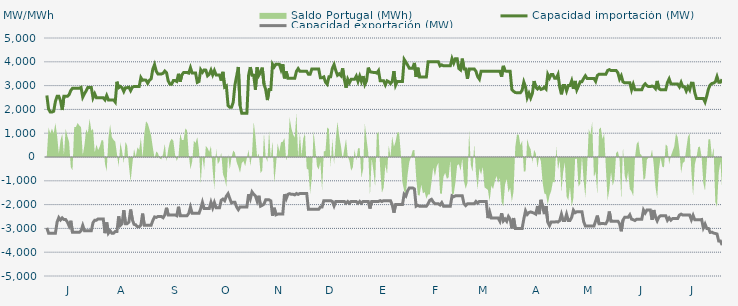
| Category | Capacidad importación (MW) | Capacidad exportación (MW) |
|---|---|---|
| 0 | 2585.417 | -2975 |
| 1900-01-01 | 2012.5 | -3200 |
| 1900-01-02 | 1887.5 | -3200 |
| 1900-01-03 | 1887.5 | -3200 |
| 1900-01-04 | 1920.833 | -3200 |
| 1900-01-05 | 2333.333 | -3200 |
| 1900-01-06 | 2550 | -2733.333 |
| 1900-01-07 | 2550 | -2545.833 |
| 1900-01-08 | 2362.5 | -2645.833 |
| 1900-01-09 | 1975 | -2558.333 |
| 1900-01-10 | 2550 | -2629.167 |
| 1900-01-11 | 2550 | -2629.167 |
| 1900-01-12 | 2550 | -2729.167 |
| 1900-01-13 | 2616.667 | -2895.833 |
| 1900-01-14 | 2793.75 | -2679.167 |
| 1900-01-15 | 2887.5 | -3166.667 |
| 1900-01-16 | 2887.5 | -3166.667 |
| 1900-01-17 | 2887.5 | -3166.667 |
| 1900-01-18 | 2887.5 | -3166.667 |
| 1900-01-19 | 2887.5 | -3166.667 |
| 1900-01-20 | 2925 | -3100 |
| 1900-01-21 | 2512.5 | -2875 |
| 1900-01-22 | 2658.333 | -3100 |
| 1900-01-23 | 2779.167 | -3100 |
| 1900-01-24 | 2925 | -3100 |
| 1900-01-25 | 2925 | -3100 |
| 1900-01-26 | 2925 | -3100 |
| 1900-01-27 | 2487.5 | -2758.333 |
| 1900-01-28 | 2656.25 | -2658.333 |
| 1900-01-29 | 2487.5 | -2654.167 |
| 1900-01-30 | 2487.5 | -2600 |
| 1900-01-31 | 2487.5 | -2600 |
| 1900-02-01 | 2487.5 | -2600 |
| 1900-02-02 | 2487.5 | -2600 |
| 1900-02-03 | 2400 | -3200 |
| 1900-02-04 | 2583.333 | -2750 |
| 1900-02-05 | 2400 | -3200 |
| 1900-02-06 | 2400 | -3100 |
| 1900-02-07 | 2400 | -3200 |
| 1900-02-08 | 2400 | -3200 |
| 1900-02-09 | 2308.333 | -3133.333 |
| 1900-02-10 | 3162.5 | -3133.333 |
| 1900-02-11 | 2910.417 | -2495.833 |
| 1900-02-12 | 2962.5 | -2875 |
| 1900-02-13 | 2912.5 | -2800 |
| 1900-02-14 | 2752.083 | -2237.5 |
| 1900-02-15 | 2912.5 | -2800 |
| 1900-02-16 | 2912.5 | -2800 |
| 1900-02-17 | 2933.333 | -2733.333 |
| 1900-02-18 | 2787.5 | -2208.333 |
| 1900-02-19 | 2929.167 | -2633.333 |
| 1900-02-20 | 2962.5 | -2829.167 |
| 1900-02-21 | 2962.5 | -2850 |
| 1900-02-22 | 2962.5 | -2933.333 |
| 1900-02-23 | 2962.5 | -2933.333 |
| 1900-02-24 | 3337.5 | -2866.667 |
| 1900-02-25 | 3222.917 | -2379.167 |
| 1900-02-26 | 3237.5 | -2866.667 |
| 1900-02-27 | 3225 | -2866.667 |
| 1900-02-28 | 3095.833 | -2866.667 |
| 1900-02-28 | 3225 | -2866.667 |
| 1900-03-01 | 3281.25 | -2866.667 |
| 1900-03-02 | 3700 | -2666.667 |
| 1900-03-03 | 3883.333 | -2516.667 |
| 1900-03-04 | 3600 | -2537.5 |
| 1900-03-05 | 3487.5 | -2500 |
| 1900-03-06 | 3487.5 | -2500 |
| 1900-03-07 | 3487.5 | -2500 |
| 1900-03-08 | 3518.75 | -2550 |
| 1900-03-09 | 3612.5 | -2433.333 |
| 1900-03-10 | 3543.75 | -2133.333 |
| 1900-03-11 | 3193.75 | -2433.333 |
| 1900-03-12 | 3060.417 | -2433.333 |
| 1900-03-13 | 3059.167 | -2433.333 |
| 1900-03-14 | 3212.5 | -2433.333 |
| 1900-03-15 | 3212.5 | -2433.333 |
| 1900-03-16 | 3175 | -2466.667 |
| 1900-03-17 | 3495.833 | -2091.667 |
| 1900-03-18 | 3166.667 | -2466.667 |
| 1900-03-19 | 3454.167 | -2466.667 |
| 1900-03-20 | 3550 | -2466.667 |
| 1900-03-21 | 3550 | -2466.667 |
| 1900-03-22 | 3550 | -2466.667 |
| 1900-03-23 | 3525 | -2366.667 |
| 1900-03-24 | 3754.167 | -2104.167 |
| 1900-03-25 | 3525 | -2366.667 |
| 1900-03-26 | 3525 | -2366.667 |
| 1900-03-27 | 3525 | -2366.667 |
| 1900-03-28 | 3135 | -2366.667 |
| 1900-03-29 | 3175 | -2366.667 |
| 1900-03-30 | 3666.667 | -2166.667 |
| 1900-03-31 | 3558.333 | -1904.167 |
| 1900-04-01 | 3658.333 | -2166.667 |
| 1900-04-02 | 3650 | -2166.667 |
| 1900-04-03 | 3412.5 | -2166.667 |
| 1900-04-04 | 3475 | -2166.667 |
| 1900-04-05 | 3650 | -1904.167 |
| 1900-04-06 | 3450 | -2133.333 |
| 1900-04-07 | 3633.333 | -1912.5 |
| 1900-04-08 | 3450 | -2133.333 |
| 1900-04-09 | 3450 | -2133.333 |
| 1900-04-10 | 3450 | -2133.333 |
| 1900-04-11 | 3210.417 | -1816.667 |
| 1900-04-12 | 3577.083 | -1766.667 |
| 1900-04-13 | 2937.5 | -1833.333 |
| 1900-04-14 | 2985.417 | -1645.833 |
| 1900-04-15 | 2162.5 | -1541.667 |
| 1900-04-16 | 2087.5 | -1745.833 |
| 1900-04-17 | 2087.5 | -1929.167 |
| 1900-04-18 | 2295.833 | -1900 |
| 1900-04-19 | 3025 | -1900 |
| 1900-04-20 | 3395.833 | -2100 |
| 1900-04-21 | 3781.25 | -2212.5 |
| 1900-04-22 | 2170.833 | -2100 |
| 1900-04-23 | 1837.5 | -2100 |
| 1900-04-24 | 1837.5 | -2100 |
| 1900-04-25 | 1837.5 | -2100 |
| 1900-04-26 | 1837.5 | -2100 |
| 1900-04-27 | 3433.333 | -1566.667 |
| 1900-04-28 | 3776 | -1760 |
| 1900-04-29 | 3433.333 | -1466.667 |
| 1900-04-30 | 3433.333 | -1566.667 |
| 1900-05-01 | 2829.167 | -1633.333 |
| 1900-05-02 | 3766.667 | -1854.167 |
| 1900-05-03 | 3433.333 | -1629.167 |
| 1900-05-04 | 3562.5 | -2066.667 |
| 1900-05-05 | 3754.167 | -2029.167 |
| 1900-05-06 | 3064.583 | -1979.167 |
| 1900-05-07 | 2833.333 | -1800 |
| 1900-05-08 | 2391.667 | -1800 |
| 1900-05-09 | 2833.333 | -1800 |
| 1900-05-10 | 2833.333 | -1841.667 |
| 1900-05-11 | 3900 | -2466.667 |
| 1900-05-12 | 3787.5 | -2133.333 |
| 1900-05-13 | 3900 | -2429.167 |
| 1900-05-14 | 3900 | -2400 |
| 1900-05-15 | 3900 | -2400 |
| 1900-05-16 | 3668.75 | -2400 |
| 1900-05-17 | 3900 | -2400 |
| 1900-05-18 | 3304.167 | -1566.667 |
| 1900-05-19 | 3595.833 | -1754.167 |
| 1900-05-20 | 3304.167 | -1566.667 |
| 1900-05-21 | 3304.167 | -1541.667 |
| 1900-05-22 | 3304.167 | -1566.667 |
| 1900-05-23 | 3304.167 | -1566.667 |
| 1900-05-24 | 3304.167 | -1591.667 |
| 1900-05-25 | 3600 | -1533.333 |
| 1900-05-26 | 3712.5 | -1570.833 |
| 1900-05-27 | 3600 | -1533.333 |
| 1900-05-28 | 3600 | -1533.333 |
| 1900-05-29 | 3600 | -1533.333 |
| 1900-05-30 | 3600 | -1533.333 |
| 1900-05-31 | 3600 | -1533.333 |
| 1900-06-01 | 3475 | -2200 |
| 1900-06-02 | 3475 | -2200 |
| 1900-06-03 | 3700 | -2200 |
| 1900-06-04 | 3700 | -2200 |
| 1900-06-05 | 3700 | -2200 |
| 1900-06-06 | 3700 | -2200 |
| 1900-06-07 | 3700 | -2200 |
| 1900-06-08 | 3329.167 | -2095.833 |
| 1900-06-09 | 3329.167 | -2095.833 |
| 1900-06-10 | 3366.667 | -1833.333 |
| 1900-06-11 | 3141.667 | -1833.333 |
| 1900-06-12 | 3058.333 | -1833.333 |
| 1900-06-13 | 3366.667 | -1833.333 |
| 1900-06-14 | 3366.667 | -1833.333 |
| 1900-06-15 | 3725 | -1866.667 |
| 1900-06-16 | 3883.333 | -2054.167 |
| 1900-06-17 | 3631.25 | -1866.667 |
| 1900-06-18 | 3435.417 | -1866.667 |
| 1900-06-19 | 3495.833 | -1866.667 |
| 1900-06-20 | 3416.667 | -1866.667 |
| 1900-06-21 | 3725 | -1866.667 |
| 1900-06-22 | 3266.667 | -1866.667 |
| 1900-06-23 | 2912.5 | -1941.667 |
| 1900-06-24 | 3266.667 | -1866.667 |
| 1900-06-25 | 3116.667 | -1941.667 |
| 1900-06-26 | 3266.667 | -1866.667 |
| 1900-06-27 | 3266.667 | -1866.667 |
| 1900-06-28 | 3266.667 | -1866.667 |
| 1900-06-29 | 3400 | -1866.667 |
| 1900-06-30 | 3175 | -1941.667 |
| 1900-07-01 | 3400 | -1866.667 |
| 1900-07-02 | 3175 | -1941.667 |
| 1900-07-03 | 3400 | -1866.667 |
| 1900-07-04 | 3047.917 | -1866.667 |
| 1900-07-05 | 3200 | -1866.667 |
| 1900-07-06 | 3754.167 | -1866.667 |
| 1900-07-07 | 3581.25 | -2166.667 |
| 1900-07-08 | 3566.667 | -1866.667 |
| 1900-07-09 | 3554.167 | -1866.667 |
| 1900-07-10 | 3554.167 | -1866.667 |
| 1900-07-11 | 3525 | -1866.667 |
| 1900-07-12 | 3629.167 | -1866.667 |
| 1900-07-13 | 3200 | -1833.333 |
| 1900-07-14 | 3200 | -1870.833 |
| 1900-07-15 | 3200 | -1833.333 |
| 1900-07-16 | 3031.25 | -1833.333 |
| 1900-07-17 | 3200 | -1833.333 |
| 1900-07-18 | 3162.5 | -1833.333 |
| 1900-07-19 | 3083.333 | -1833.333 |
| 1900-07-20 | 3175 | -2000 |
| 1900-07-21 | 3608.333 | -2337.5 |
| 1900-07-22 | 3016.667 | -2000 |
| 1900-07-23 | 3175 | -2000 |
| 1900-07-24 | 3175 | -2000 |
| 1900-07-25 | 3175 | -2000 |
| 1900-07-26 | 3175 | -2000 |
| 1900-07-27 | 4100 | -1566.667 |
| 1900-07-28 | 3987.5 | -1641.667 |
| 1900-07-29 | 3864.583 | -1425 |
| 1900-07-30 | 3733.333 | -1300 |
| 1900-07-31 | 3733.333 | -1300 |
| 1900-08-01 | 3733.333 | -1300 |
| 1900-08-02 | 3952.083 | -1341.667 |
| 1900-08-03 | 3362.5 | -2066.667 |
| 1900-08-04 | 3752.083 | -2029.167 |
| 1900-08-05 | 3362.5 | -2066.667 |
| 1900-08-06 | 3362.5 | -2066.667 |
| 1900-08-07 | 3362.5 | -2066.667 |
| 1900-08-08 | 3362.5 | -2066.667 |
| 1900-08-09 | 3362.5 | -2066.667 |
| 1900-08-10 | 4000 | -1966.667 |
| 1900-08-11 | 4000 | -1816.667 |
| 1900-08-12 | 4000 | -1779.167 |
| 1900-08-13 | 4000 | -1891.667 |
| 1900-08-14 | 4000 | -1966.667 |
| 1900-08-15 | 4000 | -1966.667 |
| 1900-08-16 | 4000 | -1966.667 |
| 1900-08-17 | 3829.167 | -2016.667 |
| 1900-08-18 | 3870.833 | -1916.667 |
| 1900-08-19 | 3829.167 | -2066.667 |
| 1900-08-20 | 3829.167 | -2066.667 |
| 1900-08-21 | 3829.167 | -2066.667 |
| 1900-08-22 | 3829.167 | -2066.667 |
| 1900-08-23 | 3829.167 | -2066.667 |
| 1900-08-24 | 4133.333 | -1633.333 |
| 1900-08-25 | 3945.833 | -1670.833 |
| 1900-08-26 | 4133.333 | -1633.333 |
| 1900-08-27 | 4133.333 | -1633.333 |
| 1900-08-28 | 3716.667 | -1633.333 |
| 1900-08-29 | 3658.333 | -1633.333 |
| 1900-08-30 | 4133.333 | -1633.333 |
| 1900-08-31 | 3700 | -1966.667 |
| 1900-09-01 | 3700 | -2041.667 |
| 1900-09-02 | 3283.333 | -1966.667 |
| 1900-09-03 | 3700 | -1966.667 |
| 1900-09-04 | 3700 | -1966.667 |
| 1900-09-05 | 3700 | -1966.667 |
| 1900-09-06 | 3700 | -1966.667 |
| 1900-09-07 | 3600 | -1866.667 |
| 1900-09-08 | 3375 | -1941.667 |
| 1900-09-09 | 3270.833 | -1866.667 |
| 1900-09-10 | 3600 | -1866.667 |
| 1900-09-11 | 3600 | -1866.667 |
| 1900-09-12 | 3600 | -1866.667 |
| 1900-09-13 | 3600 | -1866.667 |
| 1900-09-14 | 3600 | -2566.667 |
| 1900-09-15 | 3600 | -2304.167 |
| 1900-09-16 | 3600 | -2566.667 |
| 1900-09-17 | 3600 | -2566.667 |
| 1900-09-18 | 3600 | -2566.667 |
| 1900-09-19 | 3600 | -2566.667 |
| 1900-09-20 | 3600 | -2566.667 |
| 1900-09-21 | 3600 | -2700 |
| 1900-09-22 | 3375 | -2362.5 |
| 1900-09-23 | 3829.167 | -2687.5 |
| 1900-09-24 | 3616.667 | -2600 |
| 1900-09-25 | 3600 | -2700 |
| 1900-09-26 | 3600 | -2500 |
| 1900-09-27 | 3600 | -2612.5 |
| 1900-09-28 | 2833.333 | -3000 |
| 1900-09-29 | 2760.87 | -2565.217 |
| 1900-09-30 | 2708.333 | -3000 |
| 1900-10-01 | 2700 | -3000 |
| 1900-10-02 | 2700 | -3000 |
| 1900-10-03 | 2700 | -3000 |
| 1900-10-04 | 2800 | -3000 |
| 1900-10-05 | 3150 | -2600 |
| 1900-10-06 | 2945.833 | -2262.5 |
| 1900-10-07 | 2495.833 | -2412.5 |
| 1900-10-08 | 2675 | -2333.333 |
| 1900-10-09 | 2479.167 | -2308.333 |
| 1900-10-10 | 2675 | -2333.333 |
| 1900-10-11 | 3191.667 | -2358.333 |
| 1900-10-12 | 2933.333 | -2400 |
| 1900-10-13 | 2858.333 | -2062.5 |
| 1900-10-14 | 2933.333 | -2400 |
| 1900-10-15 | 2839.583 | -1800 |
| 1900-10-16 | 2864.583 | -2091.667 |
| 1900-10-17 | 2933.333 | -2400 |
| 1900-10-18 | 2858.333 | -2062.5 |
| 1900-10-19 | 3466.667 | -2733.333 |
| 1900-10-20 | 3316.667 | -2883.333 |
| 1900-10-21 | 3466.667 | -2733.333 |
| 1900-10-22 | 3466.667 | -2733.333 |
| 1900-10-23 | 3310.417 | -2733.333 |
| 1900-10-24 | 3306.25 | -2716.667 |
| 1900-10-25 | 3466.667 | -2733.333 |
| 1900-10-26 | 2933.333 | -2666.667 |
| 1900-10-27 | 2633.333 | -2404.167 |
| 1900-10-28 | 3000 | -2666.667 |
| 1900-10-29 | 3000 | -2666.667 |
| 1900-10-30 | 2775 | -2404.167 |
| 1900-10-31 | 3000 | -2666.667 |
| 1900-11-01 | 3000 | -2666.667 |
| 1900-11-02 | 3200 | -2533.333 |
| 1900-11-03 | 2862.5 | -2233.333 |
| 1900-11-04 | 3195.833 | -2341.667 |
| 1900-11-05 | 2822.917 | -2300 |
| 1900-11-06 | 2983.333 | -2300 |
| 1900-11-07 | 3166.667 | -2300 |
| 1900-11-08 | 3166.667 | -2300 |
| 1900-11-09 | 3300 | -2712.5 |
| 1900-11-10 | 3412.5 | -2900 |
| 1900-11-11 | 3300 | -2900 |
| 1900-11-12 | 3300 | -2900 |
| 1900-11-13 | 3300 | -2900 |
| 1900-11-14 | 3300 | -2900 |
| 1900-11-15 | 3300 | -2900 |
| 1900-11-16 | 3179.167 | -2687.5 |
| 1900-11-17 | 3425 | -2462.5 |
| 1900-11-18 | 3479.167 | -2800 |
| 1900-11-19 | 3479.167 | -2800 |
| 1900-11-20 | 3479.167 | -2791.667 |
| 1900-11-21 | 3479.167 | -2800 |
| 1900-11-22 | 3479.167 | -2800 |
| 1900-11-23 | 3633.333 | -2666.667 |
| 1900-11-24 | 3670.833 | -2291.667 |
| 1900-11-25 | 3633.333 | -2700 |
| 1900-11-26 | 3633.333 | -2700 |
| 1900-11-27 | 3633.333 | -2700 |
| 1900-11-28 | 3633.333 | -2700 |
| 1900-11-29 | 3541.667 | -2695.833 |
| 1900-11-30 | 3275 | -2800 |
| 1900-12-01 | 3412.5 | -3120.833 |
| 1900-12-02 | 3158.333 | -2650 |
| 1900-12-03 | 3116.667 | -2533.333 |
| 1900-12-04 | 3116.667 | -2533.333 |
| 1900-12-05 | 3116.667 | -2533.333 |
| 1900-12-06 | 3116.667 | -2429.167 |
| 1900-12-07 | 2825 | -2612.5 |
| 1900-12-08 | 3054.167 | -2633.333 |
| 1900-12-09 | 2825 | -2668.75 |
| 1900-12-10 | 2825 | -2612.5 |
| 1900-12-11 | 2825 | -2612.5 |
| 1900-12-12 | 2825 | -2612.5 |
| 1900-12-13 | 2825 | -2612.5 |
| 1900-12-14 | 2995.833 | -2229.167 |
| 1900-12-15 | 3075 | -2352.083 |
| 1900-12-16 | 2995.833 | -2229.167 |
| 1900-12-17 | 2958.333 | -2229.167 |
| 1900-12-18 | 2958.333 | -2229.167 |
| 1900-12-19 | 2981.25 | -2641.667 |
| 1900-12-20 | 2958.333 | -2229.167 |
| 1900-12-21 | 2875 | -2533.333 |
| 1900-12-22 | 3195.833 | -2683.333 |
| 1900-12-23 | 2875 | -2525 |
| 1900-12-24 | 2825 | -2466.667 |
| 1900-12-25 | 2825 | -2466.667 |
| 1900-12-26 | 2825 | -2466.667 |
| 1900-12-27 | 2825 | -2466.667 |
| 1900-12-28 | 3129.167 | -2658.333 |
| 1900-12-29 | 3283.333 | -2558.333 |
| 1900-12-30 | 3081.25 | -2654.167 |
| 1900-12-31 | 3062.5 | -2587.5 |
| 1901-01-01 | 3062.5 | -2587.5 |
| 1901-01-02 | 3062.5 | -2587.5 |
| 1901-01-03 | 3062.5 | -2587.5 |
| 1901-01-04 | 2950 | -2441.667 |
| 1901-01-05 | 3133.333 | -2400 |
| 1901-01-06 | 2950 | -2441.667 |
| 1901-01-07 | 2950 | -2441.667 |
| 1901-01-08 | 2775 | -2441.667 |
| 1901-01-09 | 2950 | -2441.667 |
| 1901-01-10 | 2818.75 | -2441.667 |
| 1901-01-11 | 3104.167 | -2637.5 |
| 1901-01-12 | 3100 | -2452.083 |
| 1901-01-13 | 2697.917 | -2637.5 |
| 1901-01-14 | 2462.5 | -2637.5 |
| 1901-01-15 | 2462.5 | -2637.5 |
| 1901-01-16 | 2462.5 | -2637.5 |
| 1901-01-17 | 2462.5 | -2625 |
| 1901-01-18 | 2462.5 | -2975 |
| 1901-01-19 | 2310.417 | -2816.667 |
| 1901-01-20 | 2562.5 | -3000 |
| 1901-01-21 | 2862.5 | -3000 |
| 1901-01-22 | 3025 | -3170.833 |
| 1901-01-23 | 3087.5 | -3158.333 |
| 1901-01-24 | 3106.25 | -3195.833 |
| 1901-01-25 | 3154.167 | -3212.917 |
| 1901-01-26 | 3377.083 | -3233.333 |
| 1901-01-27 | 3145.833 | -3533.333 |
| 1901-01-28 | 3145.833 | -3533.333 |
| 1901-01-29 | 3262.5 | -3700 |